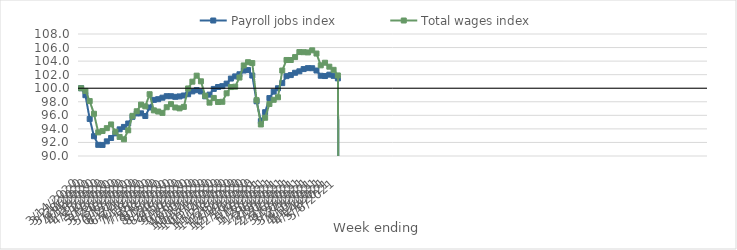
| Category | Payroll jobs index | Total wages index |
|---|---|---|
| 14/03/2020 | 100 | 100 |
| 21/03/2020 | 98.971 | 99.603 |
| 28/03/2020 | 95.467 | 98.105 |
| 04/04/2020 | 92.92 | 96.234 |
| 11/04/2020 | 91.647 | 93.487 |
| 18/04/2020 | 91.63 | 93.692 |
| 25/04/2020 | 92.16 | 94.108 |
| 02/05/2020 | 92.657 | 94.655 |
| 09/05/2020 | 93.343 | 93.578 |
| 16/05/2020 | 93.935 | 92.812 |
| 23/05/2020 | 94.291 | 92.462 |
| 30/05/2020 | 94.798 | 93.79 |
| 06/06/2020 | 95.781 | 95.926 |
| 13/06/2020 | 96.28 | 96.602 |
| 20/06/2020 | 96.296 | 97.58 |
| 27/06/2020 | 95.902 | 97.326 |
| 04/07/2020 | 97.157 | 99.113 |
| 11/07/2020 | 98.279 | 96.733 |
| 18/07/2020 | 98.382 | 96.561 |
| 25/07/2020 | 98.604 | 96.362 |
| 01/08/2020 | 98.826 | 97.197 |
| 08/08/2020 | 98.822 | 97.652 |
| 15/08/2020 | 98.73 | 97.16 |
| 22/08/2020 | 98.792 | 97.027 |
| 29/08/2020 | 98.928 | 97.246 |
| 05/09/2020 | 99.113 | 99.964 |
| 12/09/2020 | 99.531 | 100.967 |
| 19/09/2020 | 99.714 | 101.852 |
| 26/09/2020 | 99.52 | 101.02 |
| 03/10/2020 | 98.806 | 98.883 |
| 10/10/2020 | 99.055 | 97.873 |
| 17/10/2020 | 99.899 | 98.568 |
| 24/10/2020 | 100.18 | 97.964 |
| 31/10/2020 | 100.306 | 97.998 |
| 07/11/2020 | 100.68 | 99.252 |
| 14/11/2020 | 101.424 | 100.173 |
| 21/11/2020 | 101.745 | 100.229 |
| 28/11/2020 | 102.059 | 101.576 |
| 05/12/2020 | 102.608 | 103.362 |
| 12/12/2020 | 102.679 | 103.837 |
| 19/12/2020 | 101.871 | 103.708 |
| 26/12/2020 | 98.073 | 98.239 |
| 02/01/2021 | 95.142 | 94.651 |
| 09/01/2021 | 96.464 | 95.644 |
| 16/01/2021 | 98.546 | 97.678 |
| 23/01/2021 | 99.493 | 98.293 |
| 30/01/2021 | 99.995 | 98.662 |
| 06/02/2021 | 100.749 | 102.61 |
| 13/02/2021 | 101.78 | 104.166 |
| 20/02/2021 | 101.937 | 104.163 |
| 27/02/2021 | 102.282 | 104.593 |
| 06/03/2021 | 102.496 | 105.335 |
| 13/03/2021 | 102.825 | 105.317 |
| 20/03/2021 | 102.964 | 105.281 |
| 27/03/2021 | 102.951 | 105.588 |
| 03/04/2021 | 102.614 | 105.117 |
| 10/04/2021 | 101.84 | 103.377 |
| 17/04/2021 | 101.797 | 103.762 |
| 24/04/2021 | 102 | 103.175 |
| 01/05/2021 | 101.825 | 102.713 |
| 08/05/2021 | 101.453 | 101.885 |